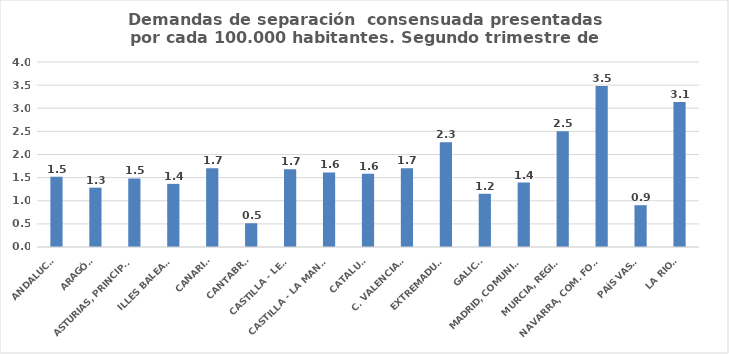
| Category | Series 0 |
|---|---|
| ANDALUCÍA | 1.517 |
| ARAGÓN | 1.283 |
| ASTURIAS, PRINCIPADO | 1.483 |
| ILLES BALEARS | 1.365 |
| CANARIAS | 1.704 |
| CANTABRIA | 0.513 |
| CASTILLA - LEÓN | 1.68 |
| CASTILLA - LA MANCHA | 1.611 |
| CATALUÑA | 1.586 |
| C. VALENCIANA | 1.703 |
| EXTREMADURA | 2.267 |
| GALICIA | 1.151 |
| MADRID, COMUNIDAD | 1.394 |
| MURCIA, REGIÓN | 2.503 |
| NAVARRA, COM. FORAL | 3.479 |
| PAÍS VASCO | 0.904 |
| LA RIOJA | 3.133 |